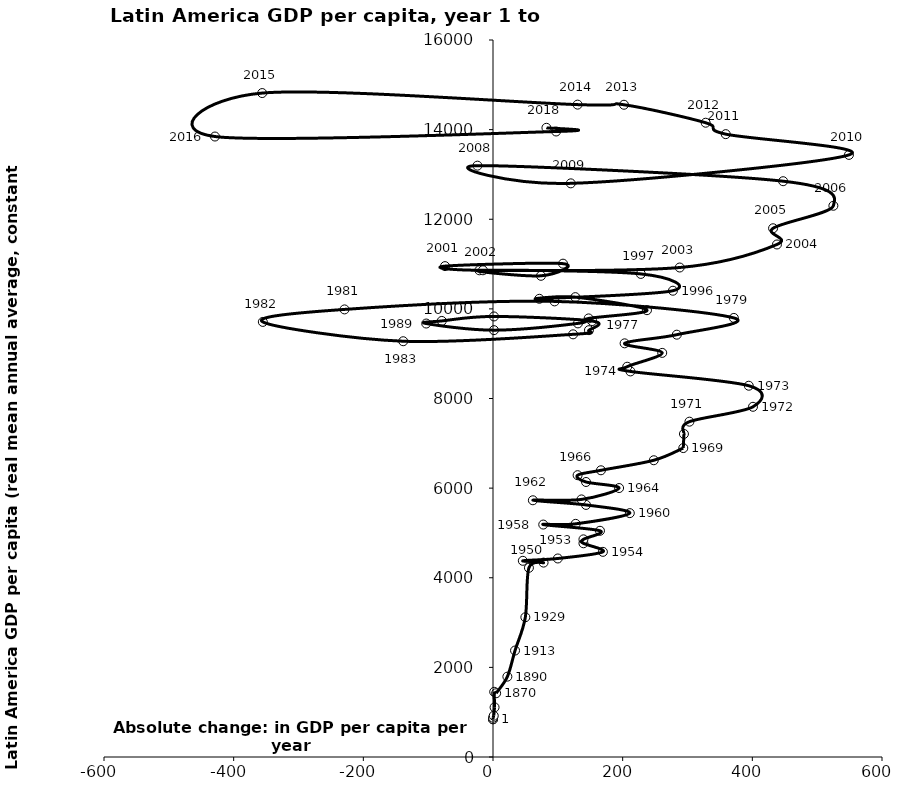
| Category | Series 0 |
|---|---|
| 1.13800638359976e-16 | 842.005 |
| 0.02311040656612641 | 842.005 |
| 0.1317672858119539 | 876.648 |
| 1.1596712447406292 | 921.066 |
| 2.4255733428300905 | 1108.582 |
| 1.8495179813133358 | 1454.692 |
| 4.832975690060344 | 1423 |
| 22.162790697674417 | 1793 |
| 34.0 | 2376 |
| 49.891891891891895 | 3119 |
| 55.40909090909091 | 4222 |
| 78.0 | 4338 |
| 46.0 | 4378 |
| 100.0 | 4430 |
| 169.5 | 4578 |
| 139.5 | 4769 |
| 139.5 | 4857 |
| 165.0 | 5048 |
| 77.5 | 5187 |
| 127.5 | 5203 |
| 211.0 | 5442 |
| 143.5 | 5625 |
| 61.5 | 5729 |
| 136.5 | 5748 |
| 194.5 | 6002 |
| 143.5 | 6137 |
| 130.5 | 6289 |
| 166.5 | 6398 |
| 248.0 | 6622 |
| 293.5 | 6894 |
| 294.5 | 7209 |
| 303.0 | 7483 |
| 401.0 | 7815 |
| 394.5 | 8285 |
| 212.0 | 8604 |
| 207.0 | 8709 |
| 261.0 | 9018 |
| 203.0 | 9231 |
| 283.5 | 9424 |
| 371.5 | 9798 |
| 95.0 | 10167 |
| -229.0 | 9988 |
| -355.0 | 9709 |
| -138.5 | 9278 |
| 123.5 | 9432 |
| 148.0 | 9525 |
| 153.0 | 9728 |
| 1.5 | 9831 |
| -79.0 | 9731 |
| -103.0 | 9673 |
| 1.5 | 9525 |
| 131.0 | 9676 |
| 147.5 | 9787 |
| 237.5 | 9971 |
| 127.0 | 10262 |
| 71.5 | 10225 |
| 277.5 | 10405 |
| 228.0 | 10780 |
| -21.0 | 10861 |
| 74.0 | 10738 |
| 108.0 | 11009 |
| -74.0 | 10954 |
| -15.5 | 10861 |
| 288.0 | 10923 |
| 438.0 | 11437 |
| 432.0 | 11799 |
| 525.0 | 12301 |
| 447.5 | 12849 |
| -24.0 | 13196 |
| 120.0 | 12801 |
| 549.0 | 13436 |
| 359.0 | 13899 |
| 328.0 | 14154 |
| 202.0 | 14555 |
| 130.5 | 14558 |
| -356.0 | 14816 |
| -428.8526501406195 | 13846 |
| 97.35461232795478 | 13958.295 |
| 82.4145249371486 | 14040.709 |